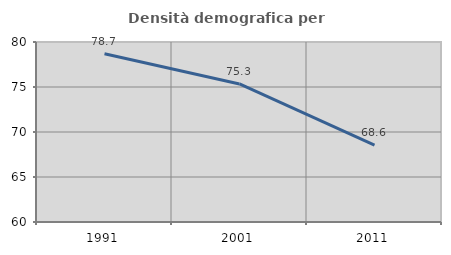
| Category | Densità demografica |
|---|---|
| 1991.0 | 78.691 |
| 2001.0 | 75.341 |
| 2011.0 | 68.552 |